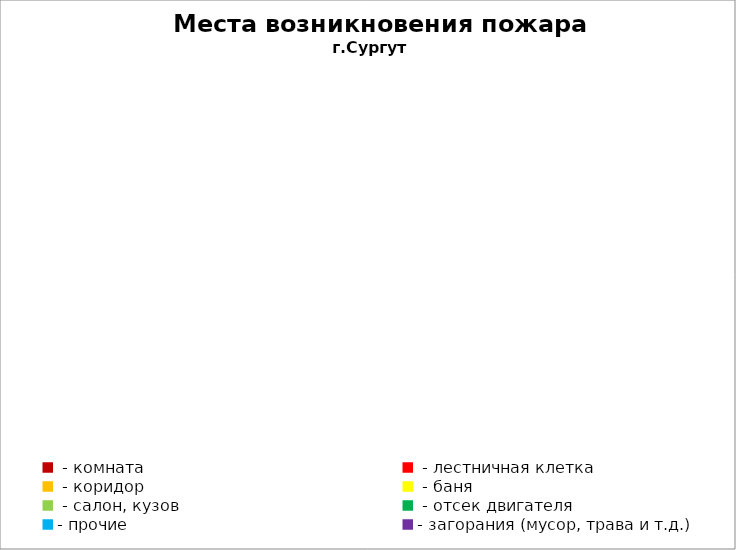
| Category | Места возникновения пожара |
|---|---|
|  - комната | 35 |
|  - лестничная клетка | 8 |
|  - коридор | 7 |
|  - баня | 15 |
|  - салон, кузов | 19 |
|  - отсек двигателя | 33 |
| - прочие | 115 |
| - загорания (мусор, трава и т.д.)  | 94 |